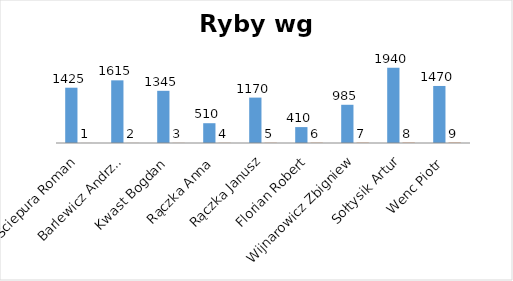
| Category | Series 0 | Series 1 |
|---|---|---|
| Ściepura Roman | 1425 | 1 |
| Barlewicz Andrzej | 1615 | 2 |
| Kwast Bogdan | 1345 | 3 |
| Rączka Anna | 510 | 4 |
| Rączka Janusz | 1170 | 5 |
| Florian Robert | 410 | 6 |
| Wijnarowicz Zbigniew | 985 | 7 |
| Sołtysik Artur | 1940 | 8 |
| Wenc Piotr | 1470 | 9 |